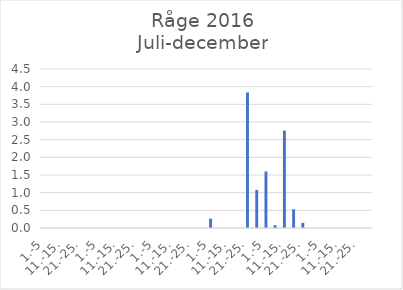
| Category | Series 0 |
|---|---|
| 1.-5 | 0 |
| 6.-10. | 0 |
| 11.-15. | 0 |
| 16.-20. | 0 |
| 21.-25. | 0 |
| 26.-31. | 0 |
| 1.-5 | 0 |
| 6.-10. | 0 |
| 11.-15. | 0 |
| 16.-20. | 0 |
| 21.-25. | 0 |
| 26.-31. | 0 |
| 1.-5 | 0 |
| 6.-10. | 0 |
| 11.-15. | 0 |
| 16.-20. | 0 |
| 21.-25. | 0 |
| 26.-30. | 0 |
| 1.-5 | 0.266 |
| 6.-10. | 0 |
| 11.-15. | 0 |
| 16.-20. | 0 |
| 21.-25. | 3.837 |
| 26.-31. | 1.079 |
| 1.-5 | 1.6 |
| 6.-10. | 0.079 |
| 11.-15. | 2.758 |
| 16.-20. | 0.528 |
| 21.-25. | 0.146 |
| 26.-30. | 0 |
| 1.-5 | 0 |
| 6.-10. | 0 |
| 11.-15. | 0 |
| 16.-20. | 0 |
| 21.-25. | 0 |
| 26.-31. | 0 |